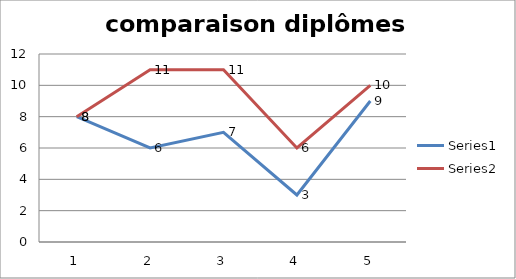
| Category | Series 0 | Series 1 |
|---|---|---|
| 0 | 8 | 8 |
| 1 | 6 | 11 |
| 2 | 7 | 11 |
| 3 | 3 | 6 |
| 4 | 9 | 10 |